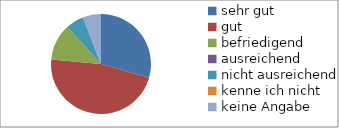
| Category | Series 0 |
|---|---|
| sehr gut | 5 |
| gut | 8 |
| befriedigend | 2 |
| ausreichend | 0 |
| nicht ausreichend | 1 |
| kenne ich nicht | 0 |
| keine Angabe | 1 |